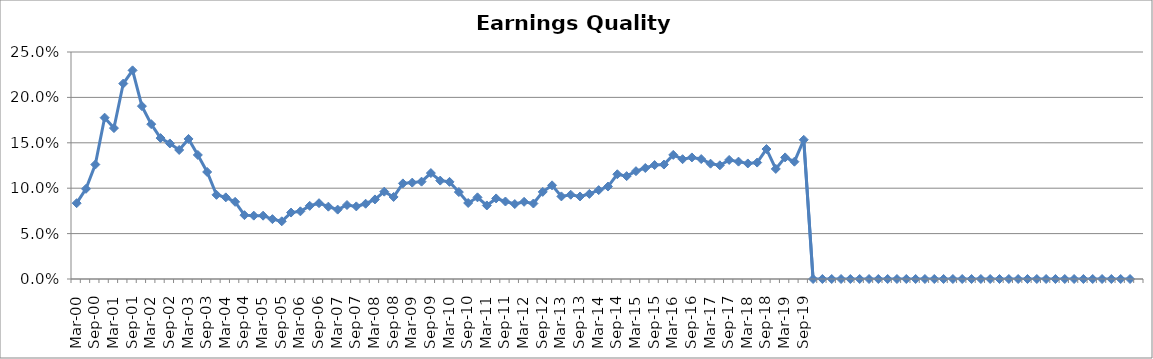
| Category | Rptd. Earnings Quality Indicator |
|---|---|
| Mar-00 | 0.083 |
| Jun-00 | 0.099 |
| Sep-00 | 0.126 |
| Dec-00 | 0.178 |
| Mar-01 | 0.166 |
| Jun-01 | 0.215 |
| Sep-01 | 0.23 |
| Dec-01 | 0.19 |
| Mar-02 | 0.171 |
| Jun-02 | 0.155 |
| Sep-02 | 0.149 |
| Dec-02 | 0.142 |
| Mar-03 | 0.154 |
| Jun-03 | 0.137 |
| Sep-03 | 0.118 |
| Dec-03 | 0.093 |
| Mar-04 | 0.09 |
| Jun-04 | 0.085 |
| Sep-04 | 0.07 |
| Dec-04 | 0.07 |
| Mar-05 | 0.07 |
| Jun-05 | 0.066 |
| Sep-05 | 0.064 |
| Dec-05 | 0.073 |
| Mar-06 | 0.075 |
| Jun-06 | 0.081 |
| Sep-06 | 0.083 |
| Dec-06 | 0.08 |
| Mar-07 | 0.076 |
| Jun-07 | 0.081 |
| Sep-07 | 0.08 |
| Dec-07 | 0.083 |
| Mar-08 | 0.088 |
| Jun-08 | 0.096 |
| Sep-08 | 0.09 |
| Dec-08 | 0.105 |
| Mar-09 | 0.106 |
| Jun-09 | 0.107 |
| Sep-09 | 0.117 |
| Dec-09 | 0.108 |
| Mar-10 | 0.107 |
| Jun-10 | 0.096 |
| Sep-10 | 0.084 |
| Dec-10 | 0.09 |
| Mar-11 | 0.081 |
| Jun-11 | 0.089 |
| Sep-11 | 0.085 |
| Dec-11 | 0.083 |
| Mar-12 | 0.085 |
| Jun-12 | 0.083 |
| Sep-12 | 0.096 |
| Dec-12 | 0.103 |
| Mar-13 | 0.091 |
| Jun-13 | 0.093 |
| Sep-13 | 0.091 |
| Dec-13 | 0.094 |
| Mar-14 | 0.098 |
| Jun-14 | 0.102 |
| Sep-14 | 0.115 |
| Dec-14 | 0.113 |
| Mar-15 | 0.119 |
| Jun-15 | 0.122 |
| Sep-15 | 0.125 |
| Dec-15 | 0.126 |
| Mar-16 | 0.137 |
| Jun-16 | 0.132 |
| Sep-16 | 0.134 |
| Dec-16 | 0.132 |
| Mar-17 | 0.127 |
| Jun-17 | 0.125 |
| Sep-17 | 0.131 |
| Dec-17 | 0.129 |
| Mar-18 | 0.127 |
| Jun-18 | 0.128 |
| Sep-18 | 0.143 |
| Dec-18 | 0.121 |
| Mar-19 | 0.134 |
| Jun-19 | 0.129 |
| Sep-19 | 0.153 |